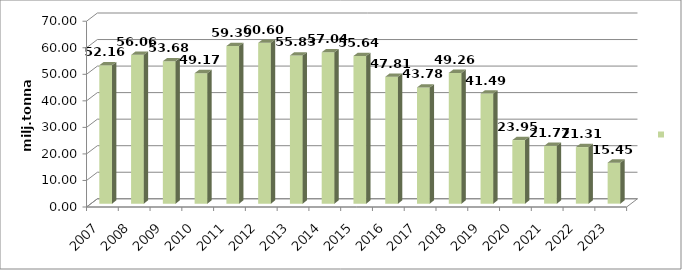
| Category | Series 0 |
|---|---|
| 2007.0 | 52.164 |
| 2008.0 | 56.061 |
| 2009.0 | 53.679 |
| 2010.0 | 49.165 |
| 2011.0 | 59.385 |
| 2012.0 | 60.602 |
| 2013.0 | 55.83 |
| 2014.0 | 57.04 |
| 2015.0 | 55.644 |
| 2016.0 | 47.813 |
| 2017.0 | 43.784 |
| 2018.0 | 49.26 |
| 2019.0 | 41.49 |
| 2020.0 | 23.952 |
| 2021.0 | 21.773 |
| 2022.0 | 21.306 |
| 2023.0 | 15.447 |